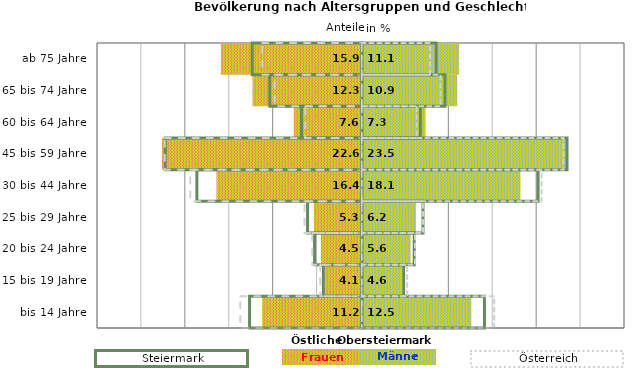
| Category | Frauen | Männer | Frauen Spalte2 | Männer Spalte2 | Frauen Spalte3 | Männer Spalte3 |
|---|---|---|---|---|---|---|
| bis 14 Jahre | -11.2 | 12.5 | 14 | -12.8 | -13.8 | 15.1 |
| 15 bis 19 Jahre | -4.1 | 4.6 | 4.8 | -4.4 | -4.7 | 5.2 |
| 20 bis 24 Jahre | -4.5 | 5.6 | 6 | -5.4 | -5.6 | 6.1 |
| 25 bis 29 Jahre | -5.3 | 6.2 | 7 | -6.2 | -6.5 | 7 |
| 30 bis 44 Jahre | -16.4 | 18.1 | 20.1 | -18.8 | -19.5 | 20.5 |
| 45 bis 59 Jahre | -22.6 | 23.5 | 23.4 | -22.4 | -22.4 | 23 |
| 60 bis 64 Jahre | -7.6 | 7.3 | 6.7 | -6.9 | -6.4 | 6.3 |
| 65 bis 74 Jahre | -12.3 | 10.9 | 9.5 | -10.5 | -9.9 | 9 |
| ab 75 Jahre | -15.9 | 11.1 | 8.5 | -12.5 | -11.3 | 7.8 |